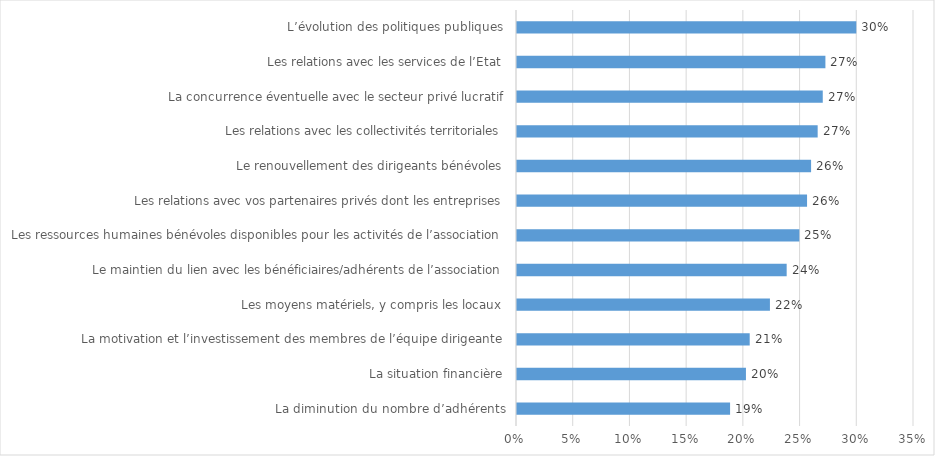
| Category | Series 0 |
|---|---|
| La diminution du nombre d’adhérents | 0.188 |
| La situation financière | 0.202 |
| La motivation et l’investissement des membres de l’équipe dirigeante | 0.205 |
| Les moyens matériels, y compris les locaux | 0.223 |
| Le maintien du lien avec les bénéficiaires/adhérents de l’association | 0.238 |
| Les ressources humaines bénévoles disponibles pour les activités de l’association | 0.249 |
|   Les relations avec vos partenaires privés dont les entreprises | 0.256 |
| Le renouvellement des dirigeants bénévoles | 0.259 |
|   Les relations avec les collectivités territoriales | 0.265 |
| La concurrence éventuelle avec le secteur privé lucratif | 0.27 |
|   Les relations avec les services de l’Etat | 0.272 |
| L’évolution des politiques publiques | 0.299 |